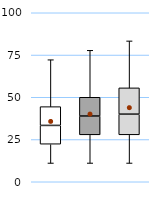
| Category | 25th | 50th | 75th |
|---|---|---|---|
| UK | 22.222 | 11.111 | 11.111 |
| Top 50% | 27.778 | 11.111 | 11.111 |
| Top 10% | 27.778 | 12.222 | 15.556 |